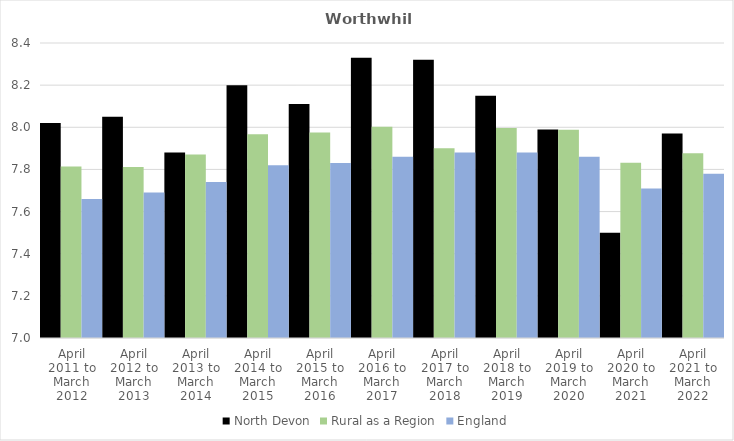
| Category | North Devon | Rural as a Region | England |
|---|---|---|---|
| April 2011 to March 2012 | 8.02 | 7.813 | 7.66 |
| April 2012 to March 2013 | 8.05 | 7.811 | 7.69 |
| April 2013 to March 2014 | 7.88 | 7.871 | 7.74 |
| April 2014 to March 2015 | 8.2 | 7.967 | 7.82 |
| April 2015 to March 2016 | 8.11 | 7.975 | 7.83 |
| April 2016 to March 2017 | 8.33 | 8.002 | 7.86 |
| April 2017 to March 2018 | 8.32 | 7.9 | 7.88 |
| April 2018 to March 2019 | 8.15 | 7.996 | 7.88 |
| April 2019 to March 2020 | 7.99 | 7.988 | 7.86 |
| April 2020 to March 2021 | 7.5 | 7.831 | 7.71 |
| April 2021 to March 2022 | 7.97 | 7.877 | 7.78 |